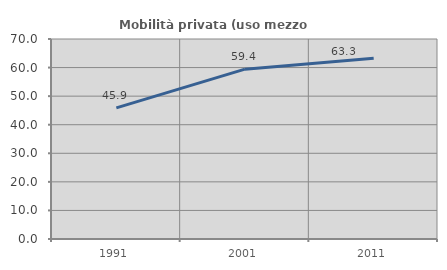
| Category | Mobilità privata (uso mezzo privato) |
|---|---|
| 1991.0 | 45.898 |
| 2001.0 | 59.448 |
| 2011.0 | 63.284 |